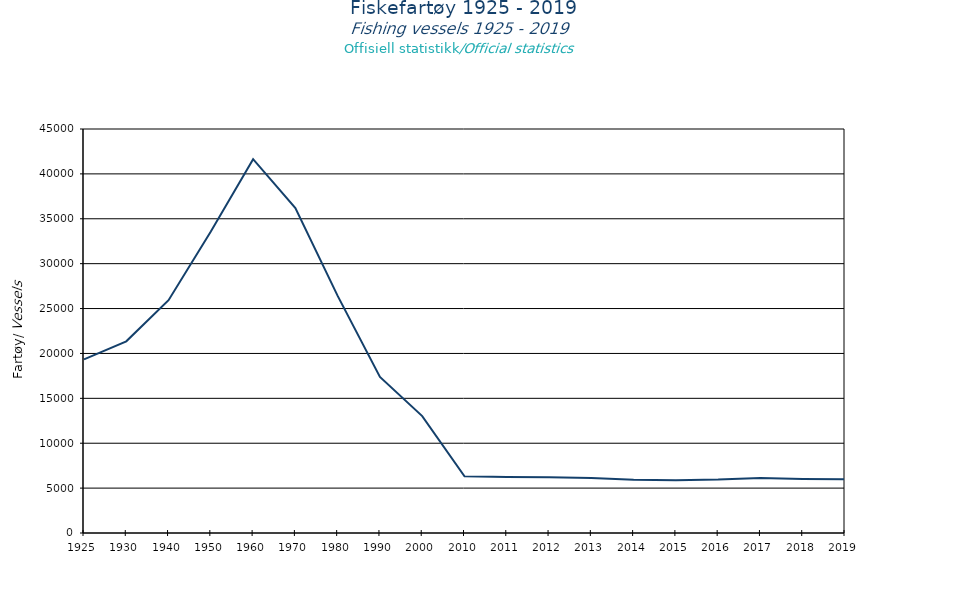
| Category | I alt/Total |
|---|---|
| 1925.0 | 19336 |
| 1930.0 | 21352 |
| 1940.0 | 25931 |
| 1950.0 | 33579 |
| 1960.0 | 41636 |
| 1970.0 | 36201 |
| 1980.0 | 26407 |
| 1990.0 | 17391 |
| 2000.0 | 13017 |
| 2010.0 | 6310 |
| 2011.0 | 6250 |
| 2012.0 | 6211 |
| 2013.0 | 6126 |
| 2014.0 | 5939 |
| 2015.0 | 5884 |
| 2016.0 | 5947 |
| 2017.0 | 6134 |
| 2018.0 | 6018 |
| 2019.0 | 5982 |